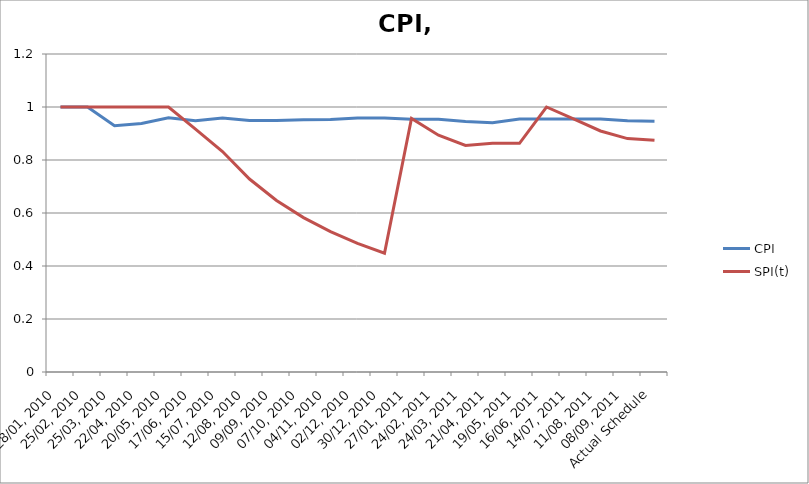
| Category | CPI | SPI(t) |
|---|---|---|
| 28/01, 2010 | 1 | 1 |
| 25/02, 2010 | 1 | 1 |
| 25/03, 2010 | 0.929 | 1 |
| 22/04, 2010 | 0.938 | 1 |
| 20/05, 2010 | 0.959 | 1 |
| 17/06, 2010 | 0.948 | 0.917 |
| 15/07, 2010 | 0.959 | 0.832 |
| 12/08, 2010 | 0.949 | 0.728 |
| 09/09, 2010 | 0.949 | 0.647 |
| 07/10, 2010 | 0.951 | 0.582 |
| 04/11, 2010 | 0.952 | 0.53 |
| 02/12, 2010 | 0.958 | 0.485 |
| 30/12, 2010 | 0.959 | 0.448 |
| 27/01, 2011 | 0.954 | 0.957 |
| 24/02, 2011 | 0.954 | 0.893 |
| 24/03, 2011 | 0.946 | 0.855 |
| 21/04, 2011 | 0.94 | 0.864 |
| 19/05, 2011 | 0.955 | 0.863 |
| 16/06, 2011 | 0.955 | 1 |
| 14/07, 2011 | 0.955 | 0.955 |
| 11/08, 2011 | 0.955 | 0.91 |
| 08/09, 2011 | 0.948 | 0.881 |
| Actual Schedule | 0.946 | 0.874 |